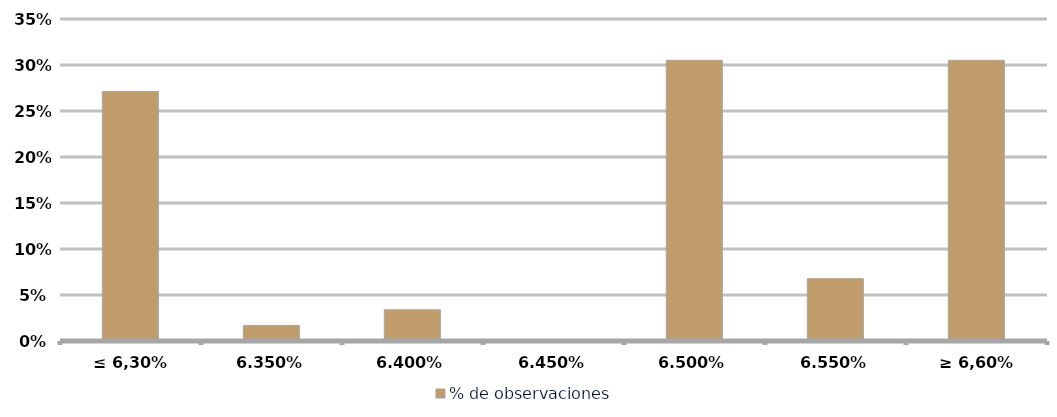
| Category | % de observaciones  |
|---|---|
| ≤ 6,30% | 0.271 |
| 6,35% | 0.017 |
| 6,40% | 0.034 |
| 6,45% | 0 |
| 6,50% | 0.305 |
| 6,55% | 0.068 |
| ≥ 6,60% | 0.305 |